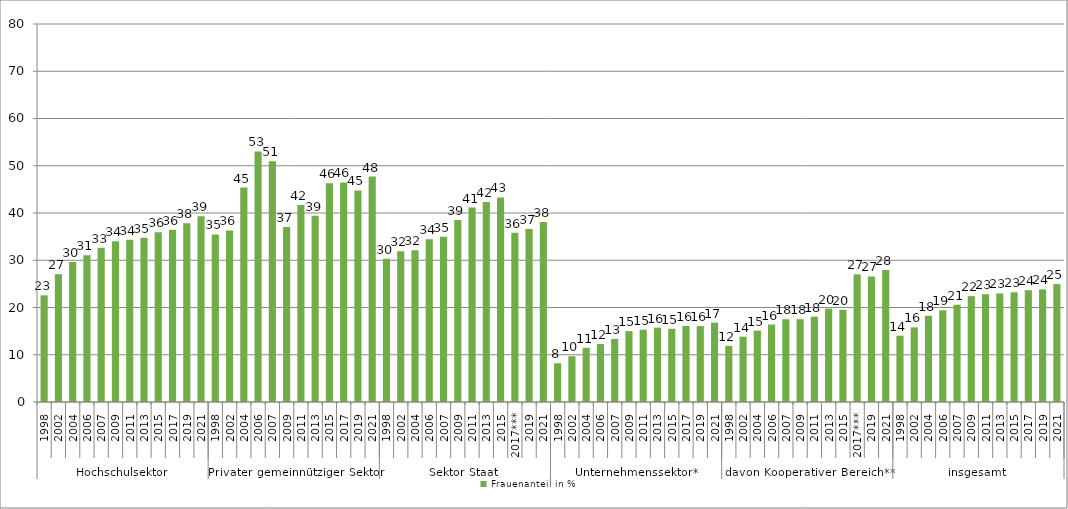
| Category | Frauenanteil in % |
|---|---|
| 0 | 22.569 |
| 1 | 27.049 |
| 2 | 29.635 |
| 3 | 31.075 |
| 4 | 32.635 |
| 5 | 34.021 |
| 6 | 34.336 |
| 7 | 34.764 |
| 8 | 35.911 |
| 9 | 36.437 |
| 10 | 37.832 |
| 11 | 39.298 |
| 12 | 35.459 |
| 13 | 36.314 |
| 14 | 45.388 |
| 15 | 53.041 |
| 16 | 50.942 |
| 17 | 37.032 |
| 18 | 41.67 |
| 19 | 39.432 |
| 20 | 46.275 |
| 21 | 46.466 |
| 22 | 44.782 |
| 23 | 47.699 |
| 24 | 30.294 |
| 25 | 31.901 |
| 26 | 32.094 |
| 27 | 34.453 |
| 28 | 34.982 |
| 29 | 38.524 |
| 30 | 41.149 |
| 31 | 42.347 |
| 32 | 43.285 |
| 33 | 35.824 |
| 34 | 36.636 |
| 35 | 38.079 |
| 36 | 8.209 |
| 37 | 9.696 |
| 38 | 11.47 |
| 39 | 12.255 |
| 40 | 13.34 |
| 41 | 15.014 |
| 42 | 15.305 |
| 43 | 15.743 |
| 44 | 15.496 |
| 45 | 16.102 |
| 46 | 16.06 |
| 47 | 16.801 |
| 48 | 11.876 |
| 49 | 13.827 |
| 50 | 15.117 |
| 51 | 16.4 |
| 52 | 17.509 |
| 53 | 17.52 |
| 54 | 18.065 |
| 55 | 19.761 |
| 56 | 19.514 |
| 57 | 27.012 |
| 58 | 26.579 |
| 59 | 27.949 |
| 60 | 14.035 |
| 61 | 15.796 |
| 62 | 18.262 |
| 63 | 19.415 |
| 64 | 20.587 |
| 65 | 22.402 |
| 66 | 22.801 |
| 67 | 22.971 |
| 68 | 23.217 |
| 69 | 23.658 |
| 70 | 23.837 |
| 71 | 24.954 |